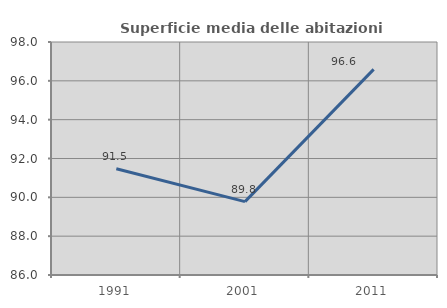
| Category | Superficie media delle abitazioni occupate |
|---|---|
| 1991.0 | 91.475 |
| 2001.0 | 89.777 |
| 2011.0 | 96.591 |